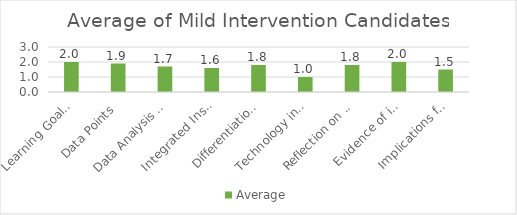
| Category | Average |
|---|---|
| Learning Goals Aligned with Pre-/Post-assessments ACEI 4.0 | 2 |
| Data Points | 1.9 |
| Data Analysis for Pedagogical Decisions ACEI 4.0 | 1.7 |
| Integrated Instruction ACEI 3.1 | 1.6 |
| Differentiation based on knowledge of individual learning ACEI 3.2 | 1.8 |
| Technology integration | 1 |
| Reflection on pedagogical decisions ACEI 1.0 | 1.8 |
| Evidence of impact on student learning ACEI 5.1 | 2 |
| Implications for teaching and professional development ACEI 5.1 | 1.5 |